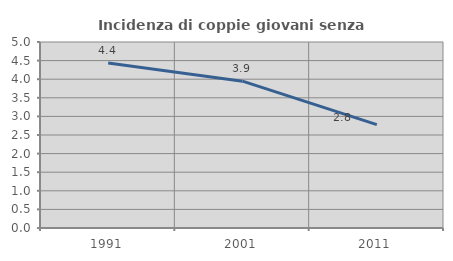
| Category | Incidenza di coppie giovani senza figli |
|---|---|
| 1991.0 | 4.437 |
| 2001.0 | 3.948 |
| 2011.0 | 2.779 |